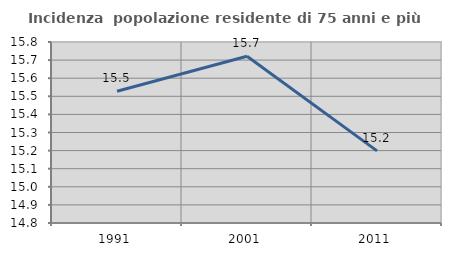
| Category | Incidenza  popolazione residente di 75 anni e più |
|---|---|
| 1991.0 | 15.528 |
| 2001.0 | 15.721 |
| 2011.0 | 15.199 |